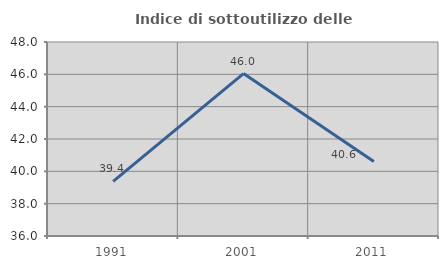
| Category | Indice di sottoutilizzo delle abitazioni  |
|---|---|
| 1991.0 | 39.375 |
| 2001.0 | 46.048 |
| 2011.0 | 40.614 |